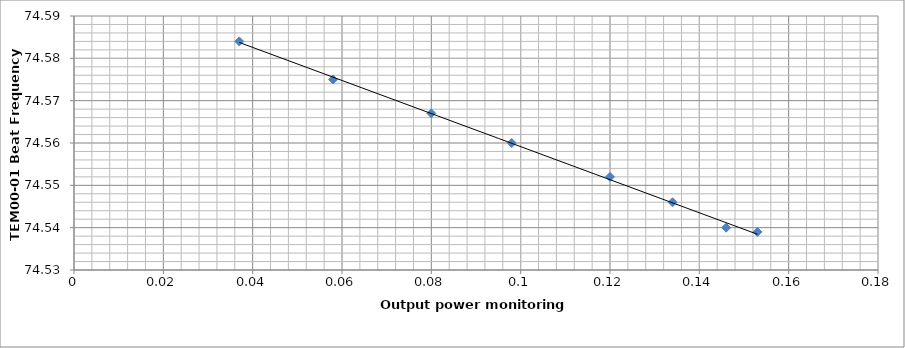
| Category | Series 0 |
|---|---|
| 0.153 | 74.539 |
| 0.146 | 74.54 |
| 0.134 | 74.546 |
| 0.12 | 74.552 |
| 0.098 | 74.56 |
| 0.08 | 74.567 |
| 0.058 | 74.575 |
| 0.037 | 74.584 |